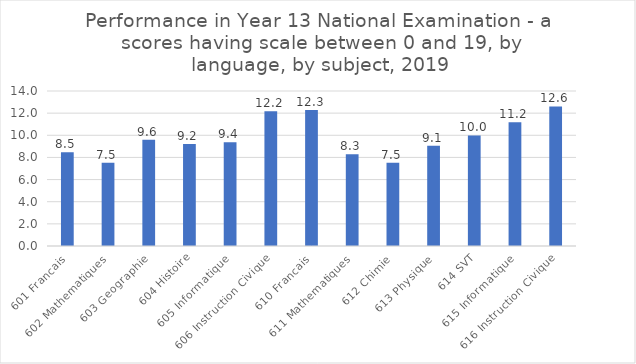
| Category | Series 0 |
|---|---|
| 601 Francais | 8.458 |
| 602 Mathematiques | 7.525 |
| 603 Geographie | 9.592 |
| 604 Histoire | 9.207 |
| 605 Informatique | 9.369 |
| 606 Instruction Civique | 12.173 |
| 610 Francais | 12.282 |
| 611 Mathematiques | 8.276 |
| 612 Chimie | 7.524 |
| 613 Physique | 9.053 |
| 614 SVT | 9.982 |
| 615 Informatique | 11.171 |
| 616 Instruction Civique | 12.606 |